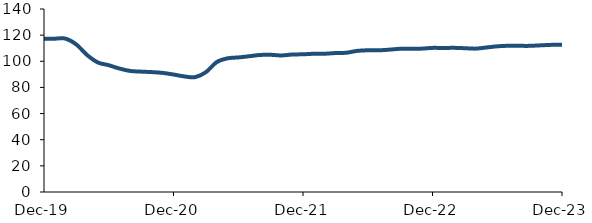
| Category | Series 0 |
|---|---|
| 2019-12-01 | 117.224 |
| 2020-01-01 | 117.309 |
| 2020-02-01 | 117.318 |
| 2020-03-01 | 112.843 |
| 2020-04-01 | 104.749 |
| 2020-05-01 | 99.065 |
| 2020-06-01 | 97 |
| 2020-07-01 | 94.403 |
| 2020-08-01 | 92.588 |
| 2020-09-01 | 92.095 |
| 2020-10-01 | 91.72 |
| 2020-11-01 | 91.108 |
| 2020-12-01 | 89.884 |
| 2021-01-01 | 88.42 |
| 2021-02-01 | 87.87 |
| 2021-03-01 | 91.662 |
| 2021-04-01 | 99.36 |
| 2021-05-01 | 102.252 |
| 2021-06-01 | 102.937 |
| 2021-07-01 | 103.85 |
| 2021-08-01 | 104.82 |
| 2021-09-01 | 104.952 |
| 2021-10-01 | 104.465 |
| 2021-11-01 | 105.171 |
| 2021-12-01 | 105.344 |
| 2022-01-01 | 105.752 |
| 2022-02-01 | 105.784 |
| 2022-03-01 | 106.289 |
| 2022-04-01 | 106.52 |
| 2022-05-01 | 107.933 |
| 2022-06-01 | 108.418 |
| 2022-07-01 | 108.373 |
| 2022-08-01 | 108.898 |
| 2022-09-01 | 109.553 |
| 2022-10-01 | 109.61 |
| 2022-11-01 | 109.687 |
| 2022-12-01 | 110.251 |
| 2023-01-01 | 110.176 |
| 2023-02-01 | 110.279 |
| 2023-03-01 | 110.001 |
| 2023-04-01 | 109.685 |
| 2023-05-01 | 110.559 |
| 2023-06-01 | 111.451 |
| 2023-07-01 | 111.863 |
| 2023-08-01 | 111.819 |
| 2023-09-01 | 111.804 |
| 2023-10-01 | 112.194 |
| 2023-11-01 | 112.565 |
| 2023-12-01 | 112.586 |